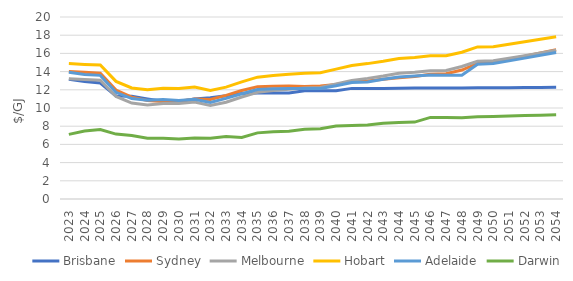
| Category | Brisbane | Sydney | Melbourne | Hobart | Adelaide | Darwin |
|---|---|---|---|---|---|---|
| 2023.0 | 13.159 | 14.008 | 13.222 | 14.88 | 13.937 | 7.102 |
| 2024.0 | 12.903 | 13.921 | 13.135 | 14.793 | 13.691 | 7.475 |
| 2025.0 | 12.739 | 13.82 | 13.061 | 14.718 | 13.586 | 7.626 |
| 2026.0 | 11.321 | 11.965 | 11.267 | 12.924 | 11.724 | 7.134 |
| 2027.0 | 11.28 | 11.192 | 10.539 | 12.201 | 11.031 | 6.978 |
| 2028.0 | 11 | 10.824 | 10.336 | 11.997 | 10.849 | 6.676 |
| 2029.0 | 10.75 | 10.701 | 10.5 | 12.162 | 10.926 | 6.674 |
| 2030.0 | 10.68 | 10.746 | 10.482 | 12.143 | 10.824 | 6.599 |
| 2031.0 | 10.98 | 10.978 | 10.649 | 12.31 | 10.959 | 6.692 |
| 2032.0 | 11.124 | 10.927 | 10.266 | 11.927 | 10.598 | 6.68 |
| 2033.0 | 11.345 | 11.389 | 10.629 | 12.291 | 11.061 | 6.863 |
| 2034.0 | 11.606 | 11.915 | 11.206 | 12.868 | 11.571 | 6.756 |
| 2035.0 | 11.656 | 12.333 | 11.73 | 13.391 | 12.023 | 7.267 |
| 2036.0 | 11.656 | 12.402 | 11.918 | 13.58 | 12.11 | 7.386 |
| 2037.0 | 11.656 | 12.422 | 12.047 | 13.709 | 12.147 | 7.443 |
| 2038.0 | 11.906 | 12.372 | 12.203 | 13.826 | 12.135 | 7.653 |
| 2039.0 | 11.906 | 12.405 | 12.245 | 13.867 | 12.156 | 7.727 |
| 2040.0 | 11.906 | 12.576 | 12.651 | 14.273 | 12.435 | 8.025 |
| 2041.0 | 12.156 | 12.898 | 13.037 | 14.659 | 12.791 | 8.079 |
| 2042.0 | 12.156 | 12.975 | 13.256 | 14.878 | 12.869 | 8.132 |
| 2043.0 | 12.156 | 13.161 | 13.514 | 15.136 | 13.156 | 8.311 |
| 2044.0 | 12.164 | 13.334 | 13.819 | 15.441 | 13.405 | 8.395 |
| 2045.0 | 12.187 | 13.466 | 13.931 | 15.553 | 13.513 | 8.449 |
| 2046.0 | 12.202 | 13.715 | 14.084 | 15.732 | 13.618 | 8.968 |
| 2047.0 | 12.202 | 13.758 | 14.129 | 15.737 | 13.599 | 8.943 |
| 2048.0 | 12.202 | 14.173 | 14.559 | 16.13 | 13.602 | 8.934 |
| 2049.0 | 12.217 | 14.9 | 15.139 | 16.713 | 14.804 | 9.034 |
| 2050.0 | 12.228 | 15.012 | 15.192 | 16.732 | 14.879 | 9.079 |
| 2051.0 | 12.238 | 15.349 | 15.472 | 16.999 | 15.178 | 9.124 |
| 2052.0 | 12.249 | 15.694 | 15.757 | 17.27 | 15.482 | 9.17 |
| 2053.0 | 12.259 | 16.046 | 16.047 | 17.546 | 15.792 | 9.216 |
| 2054.0 | 12.27 | 16.407 | 16.343 | 17.826 | 16.109 | 9.262 |